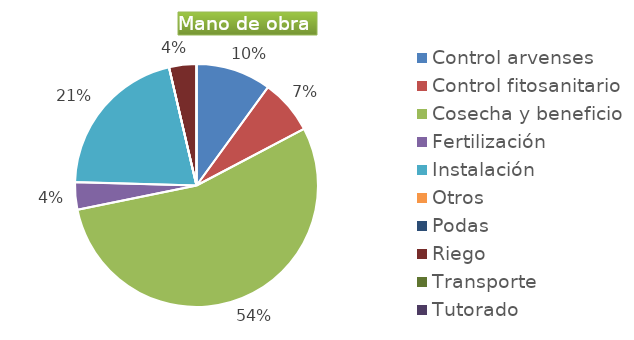
| Category | Series 0 |
|---|---|
| Control arvenses | 398277 |
| Control fitosanitario | 289656 |
| Cosecha y beneficio | 2170000 |
| Fertilización | 144828 |
| Instalación | 832761 |
| Otros | 0 |
| Podas | 0 |
| Riego | 144828 |
| Transporte | 0 |
| Tutorado | 0 |